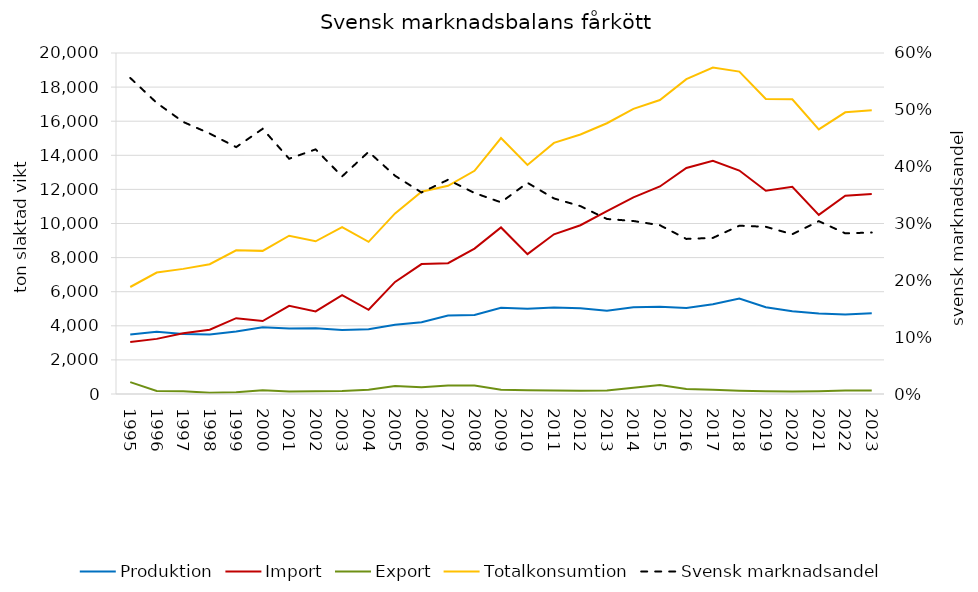
| Category | Produktion | Import | Export | Totalkonsumtion |
|---|---|---|---|---|
| 1995.0 | 3490 | 3055 | 695.333 | 6275.667 |
| 1996.0 | 3650 | 3232.667 | 182.667 | 7126 |
| 1997.0 | 3513 | 3559.333 | 160 | 7338.333 |
| 1998.0 | 3489 | 3766 | 68.333 | 7612.667 |
| 1999.0 | 3661 | 4447 | 106.333 | 8427.667 |
| 2000.0 | 3917 | 4278.667 | 227 | 8394.667 |
| 2001.0 | 3843 | 5168.333 | 153.333 | 9284 |
| 2002.0 | 3856 | 4842.667 | 166.667 | 8958 |
| 2003.0 | 3749 | 5797.667 | 181.333 | 9791.333 |
| 2004.0 | 3802 | 4940 | 245 | 8923 |
| 2005.0 | 4067 | 6573 | 474.667 | 10591.333 |
| 2006.0 | 4205 | 7619 | 390.667 | 11859.333 |
| 2007.0 | 4603 | 7673.333 | 492.667 | 12209.667 |
| 2008.0 | 4630 | 8530.667 | 495 | 13091.667 |
| 2009.0 | 5063 | 9768 | 245.667 | 15011.333 |
| 2010.0 | 4993 | 8205 | 226.333 | 13436.667 |
| 2011.0 | 5068 | 9366.667 | 201.667 | 14728 |
| 2012.0 | 5030.126 | 9897.3 | 196.3 | 15218.126 |
| 2013.0 | 4890 | 10720.7 | 204.3 | 15880.4 |
| 2014.0 | 5090 | 11535.7 | 370.3 | 16720.4 |
| 2015.0 | 5120 | 12171 | 524.7 | 17242.3 |
| 2016.0 | 5040 | 13259.3 | 296.7 | 18469.6 |
| 2017.0 | 5260 | 13680.7 | 243 | 19151.7 |
| 2018.0 | 5600 | 13104.7 | 196.7 | 18911 |
| 2019.0 | 5090 | 11925 | 158 | 17301 |
| 2020.0 | 4860 | 12153 | 147.7 | 17288.3 |
| 2021.0 | 4720 | 10504 | 158.7 | 15520.3 |
| 2022.0 | 4670 | 11629.3 | 203.3 | 16520 |
| 2023.0 | 4730 | 11725 | 200.3 | 16647.7 |